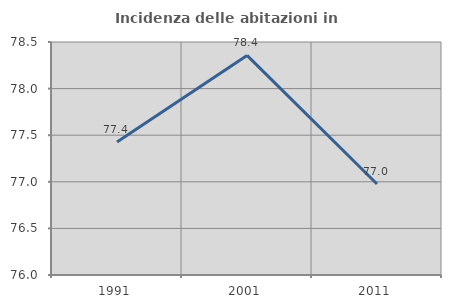
| Category | Incidenza delle abitazioni in proprietà  |
|---|---|
| 1991.0 | 77.428 |
| 2001.0 | 78.356 |
| 2011.0 | 76.976 |